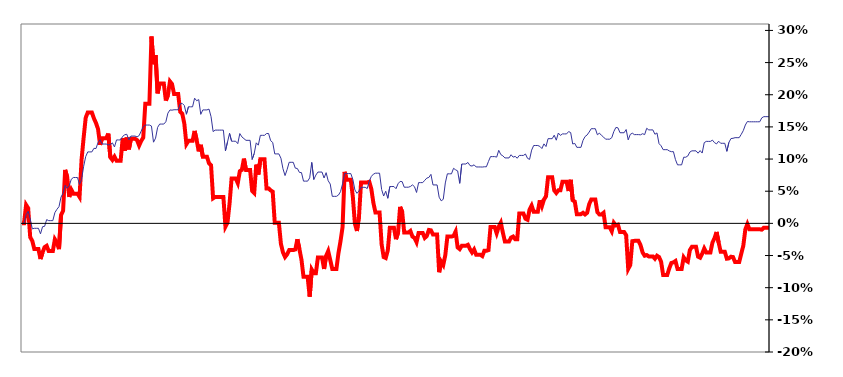
| Category | Series 0 |
|---|---|
| 12/31/11 | 0 |
| 1/1/12 | 0 |
| 1/2/12 | 0.029 |
| 1/3/12 | 0.024 |
| 1/4/12 | -0.022 |
| 1/5/12 | -0.027 |
| 1/6/12 | -0.04 |
| 1/7/12 | -0.04 |
| 1/8/12 | -0.04 |
| 1/9/12 | -0.055 |
| 1/10/12 | -0.045 |
| 1/11/12 | -0.037 |
| 1/12/12 | -0.035 |
| 1/13/12 | -0.043 |
| 1/14/12 | -0.043 |
| 1/15/12 | -0.043 |
| 1/16/12 | -0.025 |
| 1/17/12 | -0.03 |
| 1/18/12 | -0.04 |
| 1/19/12 | 0.013 |
| 1/22/12 | 0.02 |
| 1/23/12 | 0.083 |
| 1/24/12 | 0.072 |
| 1/25/12 | 0.041 |
| 1/26/12 | 0.052 |
| 1/27/12 | 0.046 |
| 1/28/12 | 0.046 |
| 1/29/12 | 0.046 |
| 1/30/12 | 0.041 |
| 1/31/12 | 0.1 |
| 2/1/12 | 0.133 |
| 2/2/12 | 0.164 |
| 2/3/12 | 0.172 |
| 2/4/12 | 0.172 |
| 2/5/12 | 0.172 |
| 2/6/12 | 0.163 |
| 2/7/12 | 0.156 |
| 2/8/12 | 0.147 |
| 2/9/12 | 0.122 |
| 2/10/12 | 0.132 |
| 2/11/12 | 0.132 |
| 2/12/12 | 0.132 |
| 2/13/12 | 0.14 |
| 2/14/12 | 0.103 |
| 2/15/12 | 0.099 |
| 2/16/12 | 0.104 |
| 2/17/12 | 0.098 |
| 2/18/12 | 0.098 |
| 2/19/12 | 0.098 |
| 2/20/12 | 0.132 |
| 2/21/12 | 0.113 |
| 2/22/12 | 0.133 |
| 2/23/12 | 0.115 |
| 2/24/12 | 0.131 |
| 2/25/12 | 0.131 |
| 2/26/12 | 0.131 |
| 2/27/12 | 0.129 |
| 2/28/12 | 0.121 |
| 2/29/12 | 0.128 |
| 3/1/12 | 0.133 |
| 3/2/12 | 0.186 |
| 3/3/12 | 0.186 |
| 3/4/12 | 0.186 |
| 3/5/12 | 0.291 |
| 3/6/12 | 0.247 |
| 3/7/12 | 0.262 |
| 3/8/12 | 0.202 |
| 3/9/12 | 0.218 |
| 3/10/12 | 0.218 |
| 3/11/12 | 0.218 |
| 3/12/12 | 0.191 |
| 3/13/12 | 0.199 |
| 3/14/12 | 0.221 |
| 3/15/12 | 0.217 |
| 3/16/12 | 0.201 |
| 3/17/12 | 0.201 |
| 3/18/12 | 0.201 |
| 3/19/12 | 0.174 |
| 3/20/12 | 0.17 |
| 3/21/12 | 0.155 |
| 3/22/12 | 0.123 |
| 3/23/12 | 0.128 |
| 3/24/12 | 0.128 |
| 3/25/12 | 0.128 |
| 3/26/12 | 0.144 |
| 3/27/12 | 0.129 |
| 3/28/12 | 0.112 |
| 3/29/12 | 0.122 |
| 3/30/12 | 0.104 |
| 3/31/12 | 0.104 |
| 4/1/12 | 0.104 |
| 4/2/12 | 0.093 |
| 4/3/12 | 0.09 |
| 4/4/12 | 0.039 |
| 4/5/12 | 0.041 |
| 4/6/12 | 0.041 |
| 4/7/12 | 0.041 |
| 4/8/12 | 0.041 |
| 4/9/12 | 0.041 |
| 4/10/12 | -0.005 |
| 4/11/12 | 0.001 |
| 4/12/12 | 0.031 |
| 4/13/12 | 0.07 |
| 4/14/12 | 0.07 |
| 4/15/12 | 0.07 |
| 4/16/12 | 0.063 |
| 4/17/12 | 0.081 |
| 4/18/12 | 0.083 |
| 4/19/12 | 0.101 |
| 4/20/12 | 0.083 |
| 4/21/12 | 0.083 |
| 4/22/12 | 0.083 |
| 4/23/12 | 0.05 |
| 4/24/12 | 0.047 |
| 4/25/12 | 0.091 |
| 4/26/12 | 0.076 |
| 4/27/12 | 0.1 |
| 4/28/12 | 0.1 |
| 4/29/12 | 0.1 |
| 4/30/12 | 0.054 |
| 5/1/12 | 0.054 |
| 5/2/12 | 0.051 |
| 5/3/12 | 0.049 |
| 5/4/12 | 0.001 |
| 5/5/12 | 0.001 |
| 5/6/12 | 0.001 |
| 5/7/12 | -0.032 |
| 5/8/12 | -0.045 |
| 5/9/12 | -0.052 |
| 5/10/12 | -0.048 |
| 5/11/12 | -0.042 |
| 5/12/12 | -0.042 |
| 5/13/12 | -0.042 |
| 5/14/12 | -0.041 |
| 5/15/12 | -0.025 |
| 5/16/12 | -0.04 |
| 5/17/12 | -0.056 |
| 5/18/12 | -0.083 |
| 5/19/12 | -0.083 |
| 5/20/12 | -0.083 |
| 5/21/12 | -0.114 |
| 5/22/12 | -0.072 |
| 5/23/12 | -0.078 |
| 5/24/12 | -0.078 |
| 5/25/12 | -0.053 |
| 5/26/12 | -0.053 |
| 5/27/12 | -0.053 |
| 5/28/12 | -0.071 |
| 5/29/12 | -0.05 |
| 5/30/12 | -0.043 |
| 5/31/12 | -0.057 |
| 6/1/12 | -0.071 |
| 6/2/12 | -0.071 |
| 6/3/12 | -0.071 |
| 6/4/12 | -0.046 |
| 6/5/12 | -0.028 |
| 6/6/12 | -0.006 |
| 6/7/12 | 0.08 |
| 6/8/12 | 0.068 |
| 6/9/12 | 0.068 |
| 6/10/12 | 0.068 |
| 6/11/12 | 0.041 |
| 6/12/12 | -0.001 |
| 6/13/12 | -0.012 |
| 6/14/12 | 0.011 |
| 6/15/12 | 0.064 |
| 6/16/12 | 0.064 |
| 6/17/12 | 0.064 |
| 6/18/12 | 0.064 |
| 6/19/12 | 0.065 |
| 6/20/12 | 0.053 |
| 6/21/12 | 0.032 |
| 6/22/12 | 0.017 |
| 6/23/12 | 0.017 |
| 6/24/12 | 0.017 |
| 6/25/12 | -0.032 |
| 6/26/12 | -0.052 |
| 6/27/12 | -0.054 |
| 6/28/12 | -0.042 |
| 6/29/12 | -0.007 |
| 6/30/12 | -0.007 |
| 7/1/12 | -0.007 |
| 7/2/12 | -0.025 |
| 7/3/12 | -0.014 |
| 7/4/12 | 0.026 |
| 7/5/12 | 0.018 |
| 7/6/12 | -0.014 |
| 7/7/12 | -0.014 |
| 7/8/12 | -0.014 |
| 7/9/12 | -0.012 |
| 7/10/12 | -0.021 |
| 7/11/12 | -0.023 |
| 7/12/12 | -0.029 |
| 7/13/12 | -0.015 |
| 7/14/12 | -0.015 |
| 7/15/12 | -0.015 |
| 7/16/12 | -0.023 |
| 7/17/12 | -0.02 |
| 7/18/12 | -0.01 |
| 7/19/12 | -0.011 |
| 7/20/12 | -0.017 |
| 7/21/12 | -0.017 |
| 7/22/12 | -0.017 |
| 7/23/12 | -0.076 |
| 7/24/12 | -0.06 |
| 7/25/12 | -0.065 |
| 7/26/12 | -0.049 |
| 7/27/12 | -0.021 |
| 7/28/12 | -0.021 |
| 7/29/12 | -0.021 |
| 7/30/12 | -0.02 |
| 7/31/12 | -0.013 |
| 8/1/12 | -0.037 |
| 8/2/12 | -0.04 |
| 8/3/12 | -0.035 |
| 8/4/12 | -0.035 |
| 8/5/12 | -0.035 |
| 8/6/12 | -0.033 |
| 8/7/12 | -0.04 |
| 8/8/12 | -0.045 |
| 8/9/12 | -0.041 |
| 8/10/12 | -0.049 |
| 8/11/12 | -0.049 |
| 8/12/12 | -0.049 |
| 8/13/12 | -0.051 |
| 8/14/12 | -0.043 |
| 8/15/12 | -0.043 |
| 8/16/12 | -0.042 |
| 8/17/12 | -0.006 |
| 8/18/12 | -0.006 |
| 8/19/12 | -0.006 |
| 8/20/12 | -0.015 |
| 8/21/12 | -0.005 |
| 8/22/12 | 0.001 |
| 8/23/12 | -0.014 |
| 8/24/12 | -0.028 |
| 8/25/12 | -0.028 |
| 8/26/12 | -0.028 |
| 8/27/12 | -0.022 |
| 8/28/12 | -0.021 |
| 8/29/12 | -0.025 |
| 8/30/12 | -0.025 |
| 8/31/12 | 0.015 |
| 9/1/12 | 0.015 |
| 9/2/12 | 0.015 |
| 9/3/12 | 0.007 |
| 9/4/12 | 0.006 |
| 9/5/12 | 0.022 |
| 9/6/12 | 0.028 |
| 9/7/12 | 0.018 |
| 9/8/12 | 0.018 |
| 9/9/12 | 0.018 |
| 9/10/12 | 0.036 |
| 9/11/12 | 0.027 |
| 9/12/12 | 0.037 |
| 9/13/12 | 0.042 |
| 9/14/12 | 0.072 |
| 9/15/12 | 0.072 |
| 9/16/12 | 0.072 |
| 9/17/12 | 0.051 |
| 9/18/12 | 0.047 |
| 9/19/12 | 0.051 |
| 9/20/12 | 0.051 |
| 9/21/12 | 0.065 |
| 9/22/12 | 0.065 |
| 9/23/12 | 0.065 |
| 9/24/12 | 0.05 |
| 9/25/12 | 0.068 |
| 9/26/12 | 0.036 |
| 9/27/12 | 0.034 |
| 9/28/12 | 0.014 |
| 9/29/12 | 0.014 |
| 9/30/12 | 0.014 |
| 10/1/12 | 0.016 |
| 10/2/12 | 0.014 |
| 10/3/12 | 0.016 |
| 10/4/12 | 0.03 |
| 10/5/12 | 0.037 |
| 10/6/12 | 0.037 |
| 10/7/12 | 0.037 |
| 10/8/12 | 0.017 |
| 10/9/12 | 0.014 |
| 10/10/12 | 0.014 |
| 10/11/12 | 0.016 |
| 10/12/12 | -0.006 |
| 10/13/12 | -0.006 |
| 10/14/12 | -0.006 |
| 10/15/12 | -0.012 |
| 10/16/12 | 0.001 |
| 10/17/12 | -0.003 |
| 10/18/12 | -0.002 |
| 10/19/12 | -0.013 |
| 10/20/12 | -0.013 |
| 10/21/12 | -0.013 |
| 10/22/12 | -0.018 |
| 10/23/12 | -0.071 |
| 10/24/12 | -0.065 |
| 10/25/12 | -0.028 |
| 10/26/12 | -0.027 |
| 10/27/12 | -0.027 |
| 10/28/12 | -0.027 |
| 10/29/12 | -0.034 |
| 10/30/12 | -0.045 |
| 10/31/12 | -0.05 |
| 11/1/12 | -0.049 |
| 11/2/12 | -0.051 |
| 11/3/12 | -0.051 |
| 11/4/12 | -0.051 |
| 11/5/12 | -0.055 |
| 11/6/12 | -0.05 |
| 11/7/12 | -0.052 |
| 11/8/12 | -0.06 |
| 11/9/12 | -0.08 |
| 11/10/12 | -0.08 |
| 11/11/12 | -0.08 |
| 11/12/12 | -0.07 |
| 11/13/12 | -0.062 |
| 11/14/12 | -0.061 |
| 11/15/12 | -0.059 |
| 11/16/12 | -0.071 |
| 11/17/12 | -0.071 |
| 11/18/12 | -0.071 |
| 11/19/12 | -0.053 |
| 11/20/12 | -0.057 |
| 11/21/12 | -0.06 |
| 11/22/12 | -0.042 |
| 11/23/12 | -0.036 |
| 11/24/12 | -0.036 |
| 11/25/12 | -0.036 |
| 11/26/12 | -0.052 |
| 11/27/12 | -0.053 |
| 11/28/12 | -0.047 |
| 11/29/12 | -0.039 |
| 11/30/12 | -0.045 |
| 12/1/12 | -0.045 |
| 12/2/12 | -0.045 |
| 12/3/12 | -0.03 |
| 12/4/12 | -0.023 |
| 12/5/12 | -0.013 |
| 12/6/12 | -0.03 |
| 12/7/12 | -0.044 |
| 12/8/12 | -0.044 |
| 12/9/12 | -0.044 |
| 12/10/12 | -0.055 |
| 12/11/12 | -0.054 |
| 12/12/12 | -0.052 |
| 12/13/12 | -0.052 |
| 12/14/12 | -0.06 |
| 12/15/12 | -0.06 |
| 12/16/12 | -0.06 |
| 12/17/12 | -0.047 |
| 12/18/12 | -0.035 |
| 12/19/12 | -0.009 |
| 12/20/12 | -0.001 |
| 12/21/12 | -0.009 |
| 12/22/12 | -0.009 |
| 12/23/12 | -0.009 |
| 12/24/12 | -0.009 |
| 12/25/12 | -0.009 |
| 12/26/12 | -0.009 |
| 12/27/12 | -0.01 |
| 12/28/12 | -0.007 |
| 12/29/12 | -0.007 |
| 12/30/12 | -0.007 |
| 12/31/12 | -0.007 |